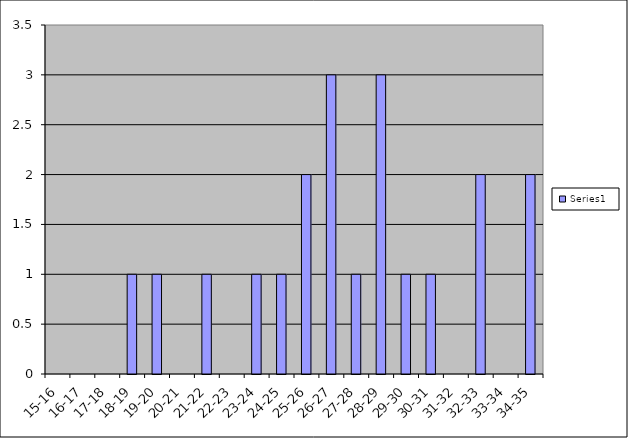
| Category | Series 0 |
|---|---|
| 15-16 | 0 |
| 16-17 | 0 |
| 17-18 | 0 |
| 18-19 | 1 |
| 19-20 | 1 |
| 20-21 | 0 |
| 21-22 | 1 |
| 22-23 | 0 |
| 23-24 | 1 |
| 24-25 | 1 |
| 25-26 | 2 |
| 26-27 | 3 |
| 27-28 | 1 |
| 28-29 | 3 |
| 29-30 | 1 |
| 30-31 | 1 |
| 31-32 | 0 |
| 32-33 | 2 |
| 33-34 | 0 |
| 34-35 | 2 |